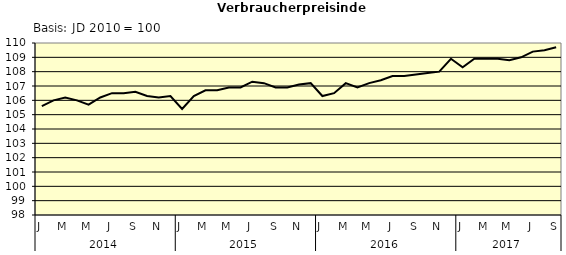
| Category | Series 0 |
|---|---|
| 0 | 105.6 |
| 1 | 106 |
| 2 | 106.2 |
| 3 | 106 |
| 4 | 105.7 |
| 5 | 106.2 |
| 6 | 106.5 |
| 7 | 106.5 |
| 8 | 106.6 |
| 9 | 106.3 |
| 10 | 106.2 |
| 11 | 106.3 |
| 12 | 105.4 |
| 13 | 106.3 |
| 14 | 106.7 |
| 15 | 106.7 |
| 16 | 106.9 |
| 17 | 106.9 |
| 18 | 107.3 |
| 19 | 107.2 |
| 20 | 106.9 |
| 21 | 106.9 |
| 22 | 107.1 |
| 23 | 107.2 |
| 24 | 106.3 |
| 25 | 106.5 |
| 26 | 107.2 |
| 27 | 106.9 |
| 28 | 107.2 |
| 29 | 107.4 |
| 30 | 107.7 |
| 31 | 107.7 |
| 32 | 107.8 |
| 33 | 107.9 |
| 34 | 108 |
| 35 | 108.9 |
| 36 | 108.3 |
| 37 | 108.9 |
| 38 | 108.9 |
| 39 | 108.9 |
| 40 | 108.8 |
| 41 | 109 |
| 42 | 109.4 |
| 43 | 109.5 |
| 44 | 109.7 |